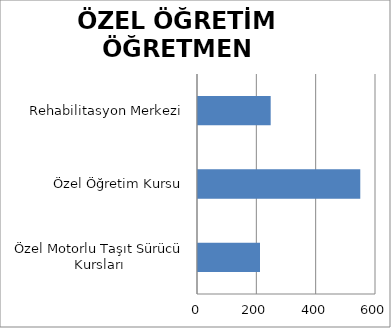
| Category | ÖZELYAYGIN EĞİTİM ÖĞRETMEN SAYISI |
|---|---|
| Özel Motorlu Taşıt Sürücü Kursları | 209 |
| Özel Öğretim Kursu | 547 |
| Rehabilitasyon Merkezi | 245 |